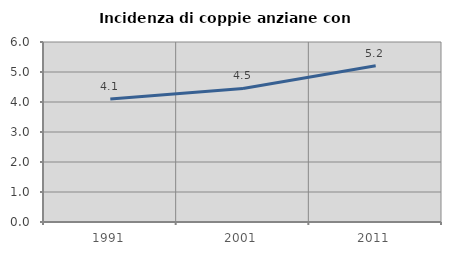
| Category | Incidenza di coppie anziane con figli |
|---|---|
| 1991.0 | 4.098 |
| 2001.0 | 4.45 |
| 2011.0 | 5.208 |